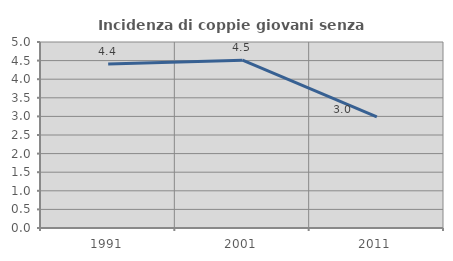
| Category | Incidenza di coppie giovani senza figli |
|---|---|
| 1991.0 | 4.411 |
| 2001.0 | 4.51 |
| 2011.0 | 2.989 |